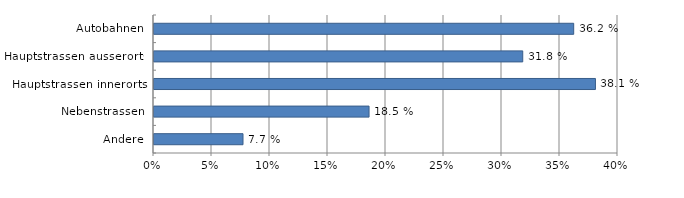
| Category | Ja |
|---|---|
| Autobahnen | 36.181 |
| Hauptstrassen ausserorts | 31.788 |
| Hauptstrassen innerorts | 38.055 |
| Nebenstrassen | 18.539 |
| Andere | 7.673 |